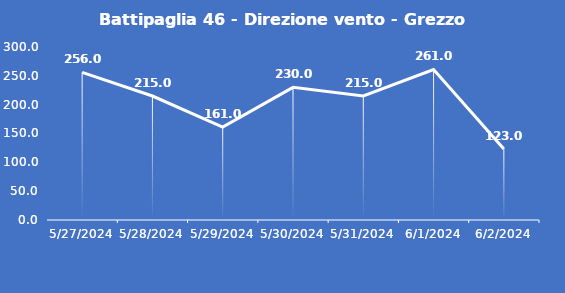
| Category | Battipaglia 46 - Direzione vento - Grezzo (°N) |
|---|---|
| 5/27/24 | 256 |
| 5/28/24 | 215 |
| 5/29/24 | 161 |
| 5/30/24 | 230 |
| 5/31/24 | 215 |
| 6/1/24 | 261 |
| 6/2/24 | 123 |